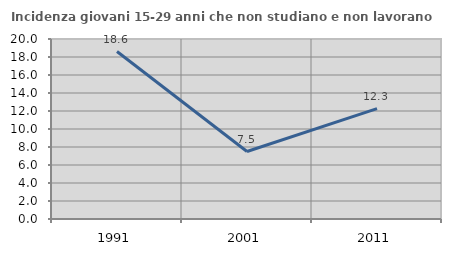
| Category | Incidenza giovani 15-29 anni che non studiano e non lavorano  |
|---|---|
| 1991.0 | 18.605 |
| 2001.0 | 7.5 |
| 2011.0 | 12.257 |